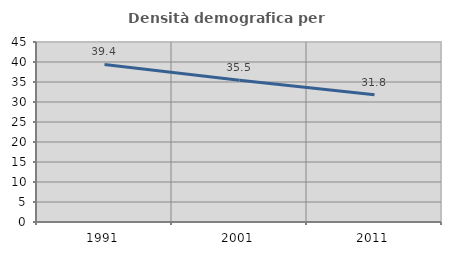
| Category | Densità demografica |
|---|---|
| 1991.0 | 39.385 |
| 2001.0 | 35.462 |
| 2011.0 | 31.819 |